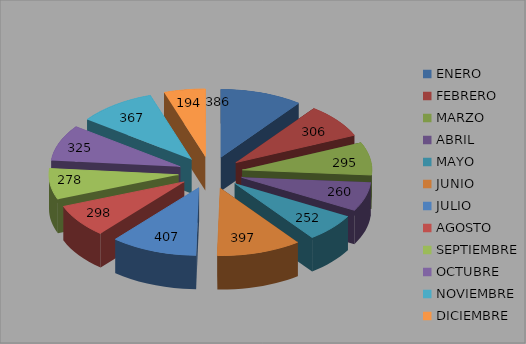
| Category | SOLICITUDES RECIBIDAS  ANUAL 2015 |
|---|---|
| ENERO | 386 |
| FEBRERO | 306 |
| MARZO | 295 |
| ABRIL | 260 |
| MAYO | 252 |
| JUNIO | 397 |
| JULIO | 407 |
| AGOSTO | 298 |
| SEPTIEMBRE | 278 |
| OCTUBRE | 325 |
| NOVIEMBRE | 367 |
| DICIEMBRE | 194 |